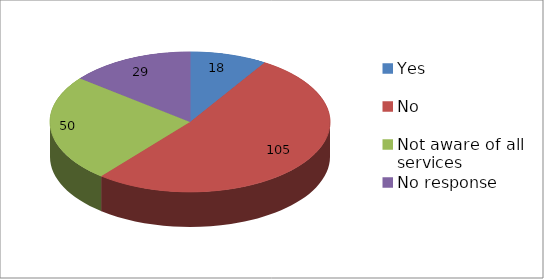
| Category | Series 0 |
|---|---|
| Yes | 18 |
| No | 105 |
| Not aware of all services | 50 |
| No response | 29 |